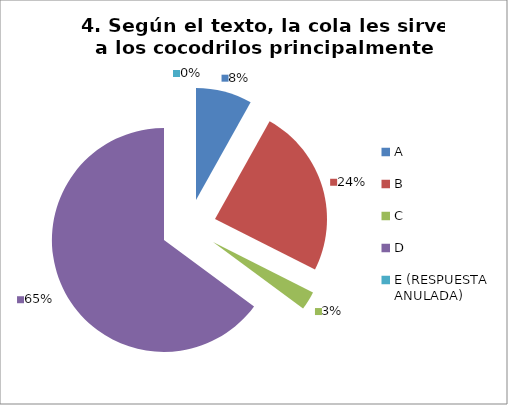
| Category | CANTIDAD DE RESPUESTAS PREGUNTA (4) | PORCENTAJE |
|---|---|---|
| A | 3 | 0.081 |
| B | 9 | 0.243 |
| C | 1 | 0.027 |
| D | 24 | 0.649 |
| E (RESPUESTA ANULADA) | 0 | 0 |